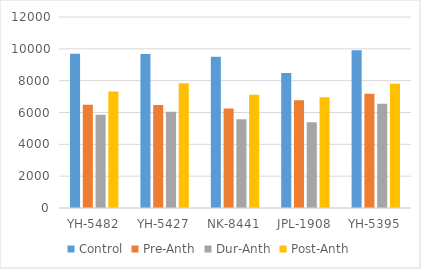
| Category | Control | Pre-Anth | Dur-Anth | Post-Anth |
|---|---|---|---|---|
| YH-5482 | 9695.297 | 6489.595 | 5851 | 7326.645 |
| YH-5427 | 9671.013 | 6469.669 | 6043 | 7831.499 |
| NK-8441 | 9510.015 | 6243.813 | 5576 | 7113.905 |
| JPL-1908 | 8478.859 | 6764.131 | 5389 | 6959.88 |
| YH-5395 | 9903.6 | 7180.483 | 6547 | 7811.975 |